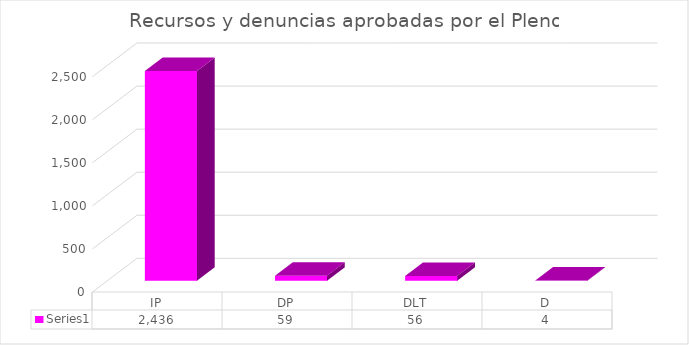
| Category | Series 0 |
|---|---|
| IP | 2436 |
| DP | 59 |
| DLT | 56 |
| D | 4 |